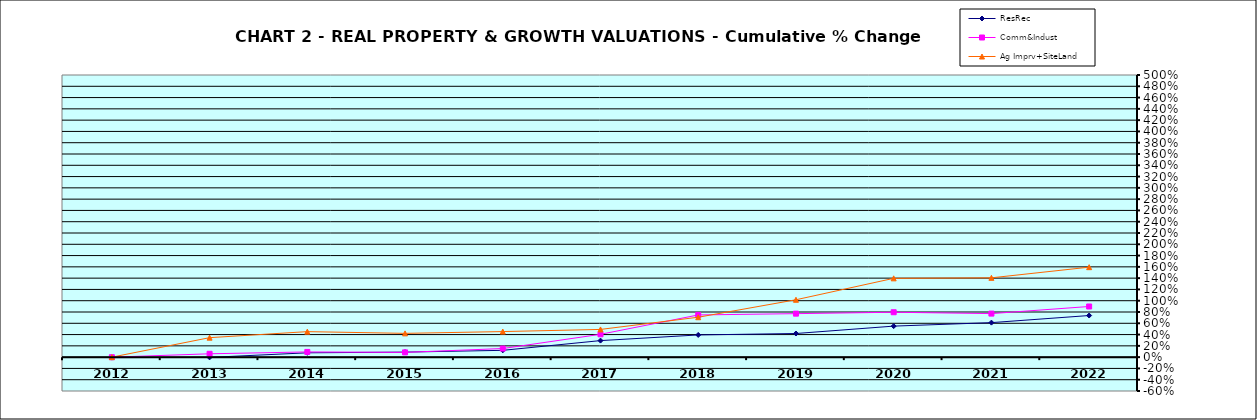
| Category | ResRec | Comm&Indust | Ag Imprv+SiteLand |
|---|---|---|---|
| 2012.0 | -0.008 | -0.001 | 0 |
| 2013.0 | -0.004 | 0.059 | 0.345 |
| 2014.0 | 0.077 | 0.092 | 0.452 |
| 2015.0 | 0.089 | 0.084 | 0.421 |
| 2016.0 | 0.121 | 0.152 | 0.453 |
| 2017.0 | 0.293 | 0.405 | 0.491 |
| 2018.0 | 0.393 | 0.748 | 0.707 |
| 2019.0 | 0.419 | 0.771 | 1.017 |
| 2020.0 | 0.55 | 0.796 | 1.396 |
| 2021.0 | 0.612 | 0.772 | 1.405 |
| 2022.0 | 0.738 | 0.898 | 1.594 |